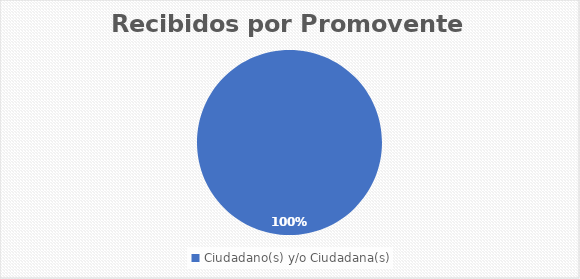
| Category | Rubro Cantidad |
|---|---|
| Ciudadano(s) y/o Ciudadana(s) | 6 |